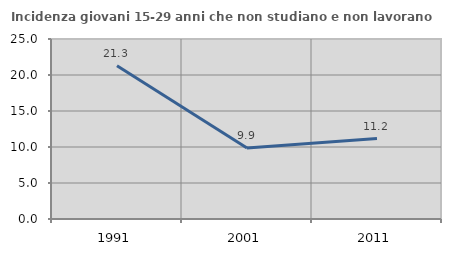
| Category | Incidenza giovani 15-29 anni che non studiano e non lavorano  |
|---|---|
| 1991.0 | 21.277 |
| 2001.0 | 9.872 |
| 2011.0 | 11.165 |